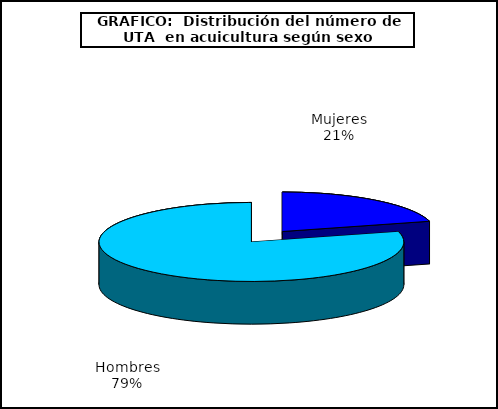
| Category | UTA | Series 1 |
|---|---|---|
| 0 | 1312 |  |
| 1 | 4989 |  |